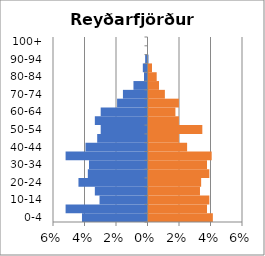
| Category | % Men | % Women |
|---|---|---|
| 0-4 | -0.042 | 0.041 |
| 5-9 | -0.052 | 0.037 |
| 10-14 | -0.03 | 0.039 |
| 15-19 | -0.033 | 0.033 |
| 20-24 | -0.044 | 0.033 |
| 25-29 | -0.038 | 0.039 |
| 30-34 | -0.037 | 0.037 |
| 35-39 | -0.052 | 0.04 |
| 40-44 | -0.039 | 0.025 |
| 45-49 | -0.032 | 0.019 |
| 50-54 | -0.03 | 0.034 |
| 55-59 | -0.033 | 0.019 |
| 60-64 | -0.03 | 0.017 |
| 65-69 | -0.019 | 0.019 |
| 70-74 | -0.016 | 0.01 |
| 75-79 | -0.009 | 0.007 |
| 80-84 | -0.002 | 0.005 |
| 85-89 | -0.003 | 0.002 |
| 90-94 | -0.001 | 0 |
| 95-99 | 0 | 0 |
| 100+ | 0 | 0 |